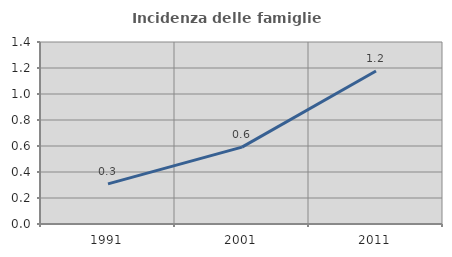
| Category | Incidenza delle famiglie numerose |
|---|---|
| 1991.0 | 0.309 |
| 2001.0 | 0.592 |
| 2011.0 | 1.176 |